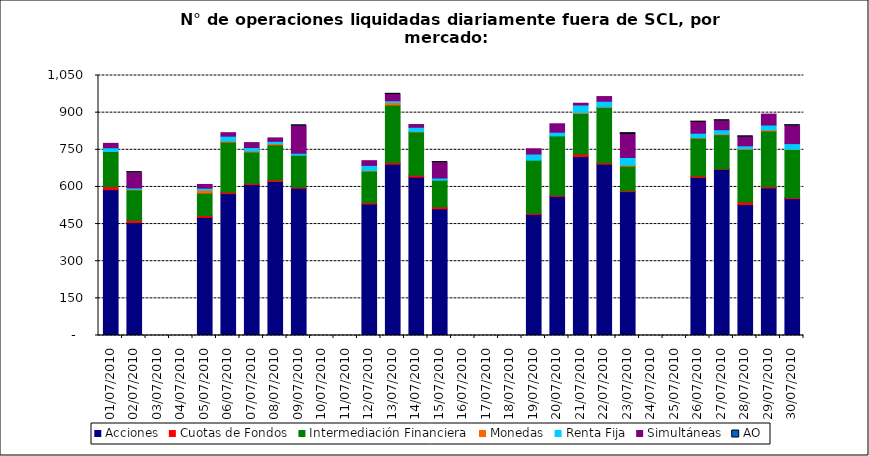
| Category | Acciones | Cuotas de Fondos | Intermediación Financiera | Monedas | Renta Fija | Simultáneas | AO |
|---|---|---|---|---|---|---|---|
| 01/07/2010 | 589 | 12 | 142 | 0 | 15 | 18 | 0 |
| 02/07/2010 | 456 | 9 | 123 | 2 | 6 | 61 | 2 |
| 05/07/2010 | 477 | 7 | 91 | 12 | 8 | 15 | 0 |
| 06/07/2010 | 573 | 6 | 202 | 4 | 20 | 14 | 0 |
| 07/07/2010 | 610 | 5 | 126 | 4 | 14 | 20 | 0 |
| 08/07/2010 | 622 | 6 | 142 | 5 | 9 | 14 | 0 |
| 09/07/2010 | 595 | 4 | 129 | 0 | 8 | 110 | 2 |
| 12/07/2010 | 531 | 5 | 128 | 2 | 21 | 19 | 0 |
| 13/07/2010 | 692 | 7 | 232 | 10 | 7 | 26 | 1 |
| 14/07/2010 | 640 | 7 | 175 | 2 | 17 | 11 | 0 |
| 15/07/2010 | 512 | 7 | 108 | 0 | 9 | 62 | 1 |
| 19/07/2010 | 489 | 5 | 214 | 0 | 25 | 21 | 0 |
| 20/07/2010 | 562 | 4 | 240 | 0 | 15 | 34 | 0 |
| 21/07/2010 | 723 | 10 | 164 | 3 | 31 | 7 | 0 |
| 22/07/2010 | 692 | 6 | 224 | 1 | 23 | 19 | 0 |
| 23/07/2010 | 581 | 4 | 99 | 4 | 31 | 93 | 5 |
| 26/07/2010 | 638 | 6 | 153 | 2 | 18 | 44 | 2 |
| 27/07/2010 | 671 | 2 | 138 | 3 | 17 | 36 | 1 |
| 28/07/2010 | 529 | 10 | 213 | 2 | 12 | 36 | 1 |
| 29/07/2010 | 596 | 5 | 225 | 4 | 20 | 44 | 0 |
| 30/07/2010 | 553 | 4 | 194 | 1 | 23 | 72 | 1 |